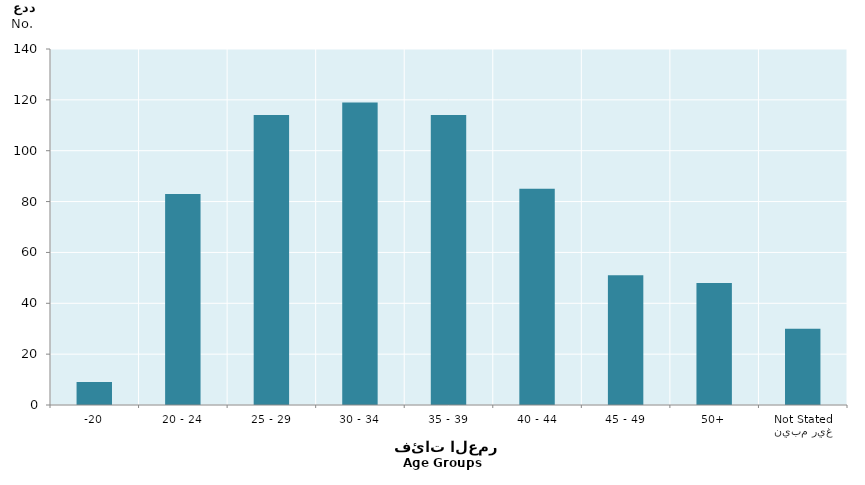
| Category | Series 0 |
|---|---|
| -20 | 9 |
| 20 - 24 | 83 |
| 25 - 29 | 114 |
| 30 - 34 | 119 |
| 35 - 39 | 114 |
| 40 - 44 | 85 |
| 45 - 49 | 51 |
| 50+ | 48 |
| غير مبين
Not Stated | 30 |